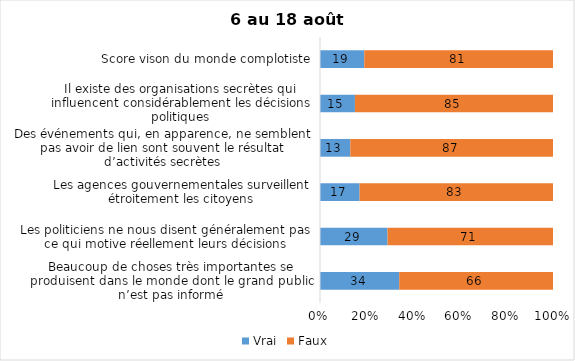
| Category | Vrai | Faux |
|---|---|---|
| Beaucoup de choses très importantes se produisent dans le monde dont le grand public n’est pas informé | 34 | 66 |
| Les politiciens ne nous disent généralement pas ce qui motive réellement leurs décisions | 29 | 71 |
| Les agences gouvernementales surveillent étroitement les citoyens | 17 | 83 |
| Des événements qui, en apparence, ne semblent pas avoir de lien sont souvent le résultat d’activités secrètes | 13 | 87 |
| Il existe des organisations secrètes qui influencent considérablement les décisions politiques | 15 | 85 |
| Score vison du monde complotiste | 19 | 81 |